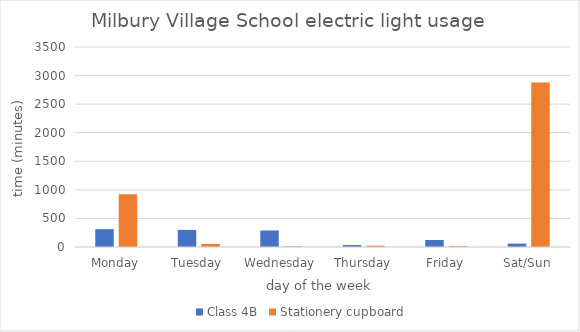
| Category | Class 4B | Stationery cupboard |
|---|---|---|
| Monday | 312 | 923 |
| Tuesday | 299 | 54 |
| Wednesday | 289 | 12 |
| Thursday | 34 | 23 |
| Friday | 122 | 17 |
| Sat/Sun | 59 | 2880 |